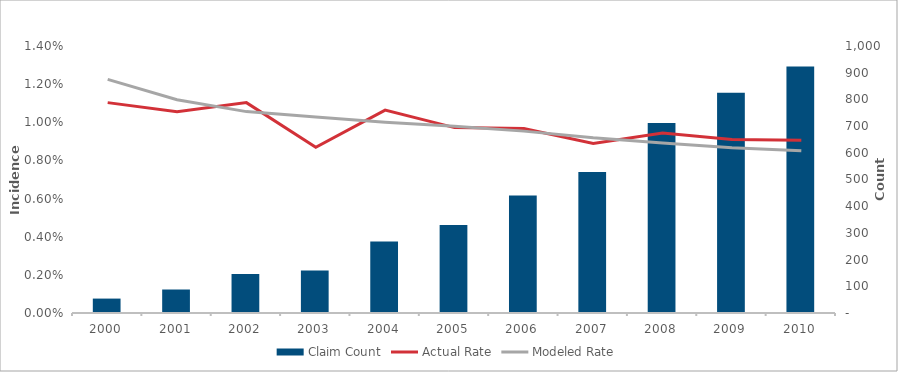
| Category | Claim Count |
|---|---|
| 2000.0 | 54 |
| 2001.0 | 88 |
| 2002.0 | 146 |
| 2003.0 | 159 |
| 2004.0 | 268 |
| 2005.0 | 330 |
| 2006.0 | 440 |
| 2007.0 | 528 |
| 2008.0 | 712 |
| 2009.0 | 825 |
| 2010.0 | 923 |